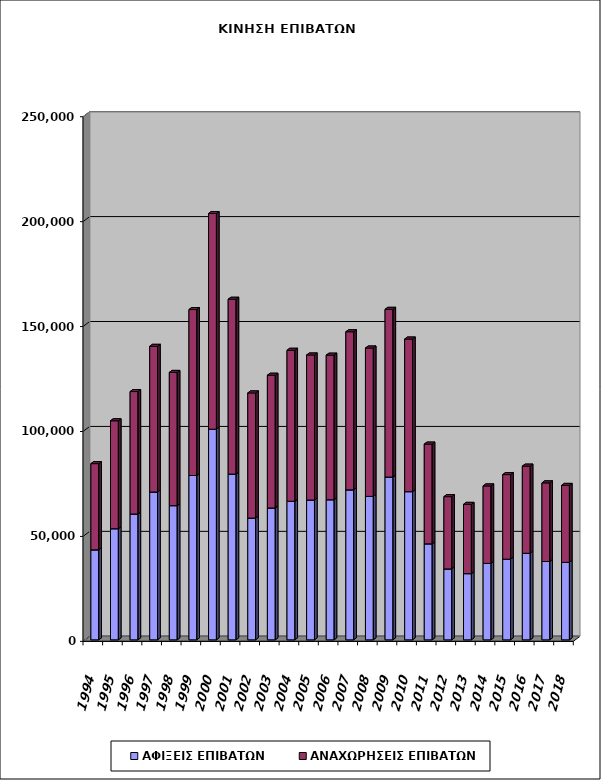
| Category | ΑΦΙΞΕΙΣ ΕΠΙΒΑΤΩΝ | ΑΝΑΧΩΡΗΣΕΙΣ ΕΠΙΒΑΤΩΝ |
|---|---|---|
| 1994.0 | 42867 | 41085 |
| 1995.0 | 52951 | 51434 |
| 1996.0 | 59966 | 58347 |
| 1997.0 | 70441 | 69414 |
| 1998.0 | 63941 | 63494 |
| 1999.0 | 78306 | 79077 |
| 2000.0 | 100364 | 102786 |
| 2001.0 | 78970 | 83327 |
| 2002.0 | 58025 | 59628 |
| 2003.0 | 62829 | 63261 |
| 2004.0 | 66038 | 71935 |
| 2005.0 | 66623 | 69114 |
| 2006.0 | 66762 | 68893 |
| 2007.0 | 71463 | 75343 |
| 2008.0 | 68354 | 70710 |
| 2009.0 | 77576 | 79914 |
| 2010.0 | 70613 | 72720 |
| 2011.0 | 45742 | 47529 |
| 2012.0 | 33792 | 34440 |
| 2013.0 | 31542 | 33003 |
| 2014.0 | 36423 | 36917 |
| 2015.0 | 38435 | 40310 |
| 2016.0 | 41241 | 41534 |
| 2017.0 | 37318 | 37469 |
| 2018.0 | 36927 | 36656 |